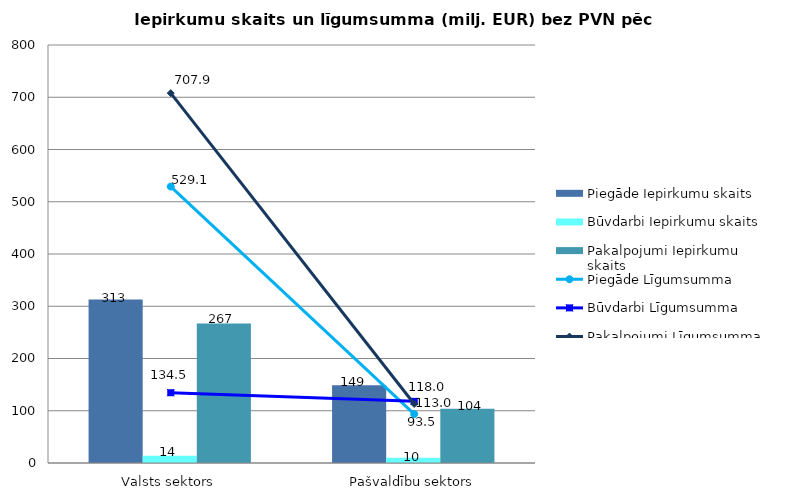
| Category | Piegāde Iepirkumu skaits | Būvdarbi Iepirkumu skaits | Pakalpojumi Iepirkumu skaits |
|---|---|---|---|
| Valsts sektors | 313 | 14 | 267 |
| Pašvaldību sektors | 149 | 10 | 104 |